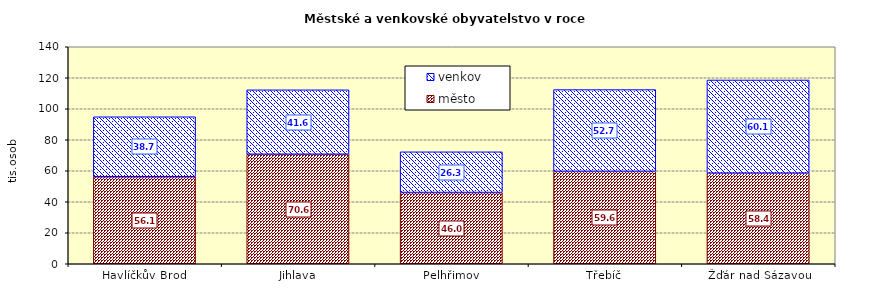
| Category | město | venkov |
|---|---|---|
| Havlíčkův Brod | 56139 | 38704 |
| Jihlava | 70637 | 41583 |
| Pelhřimov | 45958 | 26266 |
| Třebíč | 59637 | 52735 |
| Žďár nad Sázavou | 58435 | 60115 |